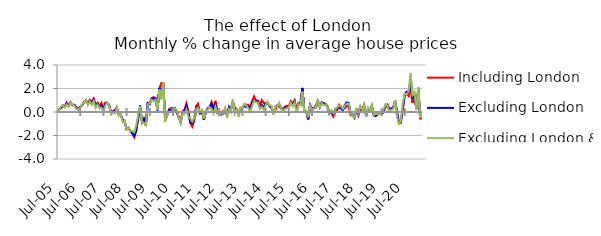
| Category | Including London | Excluding London | Excluding London & SE |
|---|---|---|---|
| 2005-07-01 | 0.014 | -0.006 | 0.09 |
| 2005-08-01 | 0.163 | 0.204 | 0.162 |
| 2005-09-01 | 0.324 | 0.325 | 0.462 |
| 2005-10-01 | 0.577 | 0.533 | 0.574 |
| 2005-11-01 | 0.466 | 0.417 | 0.391 |
| 2005-12-01 | 0.812 | 0.711 | 0.637 |
| 2006-01-01 | 0.5 | 0.49 | 0.413 |
| 2006-02-01 | 0.828 | 0.794 | 0.795 |
| 2006-03-01 | 0.563 | 0.637 | 0.633 |
| 2006-04-01 | 0.621 | 0.57 | 0.521 |
| 2006-05-01 | 0.386 | 0.352 | 0.256 |
| 2006-06-01 | 0.291 | 0.226 | 0.232 |
| 2006-07-01 | 0.438 | 0.412 | 0.342 |
| 2006-08-01 | 0.591 | 0.577 | 0.661 |
| 2006-09-01 | 0.848 | 0.81 | 0.786 |
| 2006-10-01 | 0.979 | 1.005 | 1.049 |
| 2006-11-01 | 0.775 | 0.651 | 0.593 |
| 2006-12-01 | 1.037 | 0.905 | 0.892 |
| 2007-01-01 | 0.858 | 0.697 | 0.609 |
| 2007-02-01 | 1.157 | 1.043 | 0.936 |
| 2007-03-01 | 0.591 | 0.493 | 0.34 |
| 2007-04-01 | 0.791 | 0.71 | 0.625 |
| 2007-05-01 | 0.495 | 0.385 | 0.394 |
| 2007-06-01 | 0.773 | 0.572 | 0.376 |
| 2007-07-01 | 0.314 | 0.122 | 0.088 |
| 2007-08-01 | 0.802 | 0.688 | 0.543 |
| 2007-09-01 | 0.779 | 0.781 | 0.791 |
| 2007-10-01 | 0.566 | 0.59 | 0.551 |
| 2007-11-01 | -0.121 | -0.088 | -0.213 |
| 2007-12-01 | 0.07 | 0.05 | -0.02 |
| 2008-01-01 | 0.193 | 0.09 | -0.129 |
| 2008-02-01 | 0.407 | 0.326 | 0.403 |
| 2008-03-01 | -0.27 | -0.262 | -0.309 |
| 2008-04-01 | -0.198 | -0.21 | -0.151 |
| 2008-05-01 | -0.666 | -0.685 | -0.88 |
| 2008-06-01 | -0.763 | -0.783 | -0.746 |
| 2008-07-01 | -1.456 | -1.471 | -1.501 |
| 2008-08-01 | -1.333 | -1.353 | -1.313 |
| 2008-09-01 | -1.666 | -1.602 | -1.648 |
| 2008-10-01 | -1.827 | -1.811 | -1.607 |
| 2008-11-01 | -2.152 | -2.056 | -1.731 |
| 2008-12-01 | -1.511 | -1.621 | -1.176 |
| 2009-01-01 | -0.593 | -0.517 | -0.245 |
| 2009-02-01 | 0.356 | 0.548 | 0.469 |
| 2009-03-01 | -0.862 | -0.838 | -0.892 |
| 2009-04-01 | -0.536 | -0.573 | -0.91 |
| 2009-05-01 | -0.786 | -1.169 | -1.113 |
| 2009-06-01 | 0.762 | 0.765 | 0.654 |
| 2009-07-01 | 0.77 | 0.668 | 0.757 |
| 2009-08-01 | 1.139 | 1.168 | 1.057 |
| 2009-09-01 | 1.284 | 1.066 | 0.915 |
| 2009-10-01 | 1.145 | 1.185 | 1.057 |
| 2009-11-01 | 0.204 | 0.132 | 0.175 |
| 2009-12-01 | 1.994 | 2.051 | 1.926 |
| 2010-01-01 | 2.456 | 1.338 | 1.065 |
| 2010-02-01 | 2.445 | 2.446 | 2.482 |
| 2010-03-01 | -0.631 | -0.699 | -0.798 |
| 2010-04-01 | -0.337 | -0.232 | -0.267 |
| 2010-05-01 | 0.08 | 0.209 | 0.025 |
| 2010-06-01 | 0.344 | 0.125 | 0.033 |
| 2010-07-01 | 0.307 | 0.142 | -0.011 |
| 2010-08-01 | 0.345 | 0.255 | 0.288 |
| 2010-09-01 | -0.055 | 0.062 | 0.191 |
| 2010-10-01 | -0.41 | -0.446 | -0.406 |
| 2010-11-01 | -0.762 | -0.901 | -0.892 |
| 2010-12-01 | 0.039 | -0.111 | -0.135 |
| 2011-01-01 | 0.213 | 0.123 | -0.163 |
| 2011-02-01 | 0.73 | 0.546 | 0.225 |
| 2011-03-01 | 0.086 | -0.077 | -0.432 |
| 2011-04-01 | -0.954 | -0.902 | -0.557 |
| 2011-05-01 | -1.249 | -0.981 | -0.818 |
| 2011-06-01 | -0.74 | -0.596 | -0.5 |
| 2011-07-01 | 0.505 | 0.275 | 0.127 |
| 2011-08-01 | 0.701 | 0.46 | 0.372 |
| 2011-09-01 | -0.047 | -0.129 | 0.006 |
| 2011-10-01 | 0.117 | 0.014 | 0.143 |
| 2011-11-01 | -0.617 | -0.667 | -0.587 |
| 2011-12-01 | 0.055 | -0.052 | 0.093 |
| 2012-01-01 | 0.295 | 0.294 | 0.186 |
| 2012-02-01 | 0.36 | 0.421 | 0.403 |
| 2012-03-01 | 0.843 | 0.717 | 0.273 |
| 2012-04-01 | 0.364 | 0.061 | -0.139 |
| 2012-05-01 | 0.952 | 0.595 | 0.425 |
| 2012-06-01 | -0.019 | -0.101 | -0.026 |
| 2012-07-01 | -0.072 | -0.142 | -0.294 |
| 2012-08-01 | -0.223 | -0.16 | -0.074 |
| 2012-09-01 | 0.09 | -0.186 | -0.136 |
| 2012-10-01 | 0.146 | 0.175 | 0.348 |
| 2012-11-01 | 0.01 | -0.282 | -0.45 |
| 2012-12-01 | 0.315 | 0.413 | 0.258 |
| 2013-01-01 | 0.332 | 0.067 | 0.042 |
| 2013-02-01 | 0.833 | 0.921 | 1.056 |
| 2013-03-01 | 0.377 | 0.077 | -0.149 |
| 2013-04-01 | 0.245 | 0.201 | 0.193 |
| 2013-05-01 | -0.058 | -0.181 | -0.399 |
| 2013-06-01 | 0.126 | 0.163 | 0.425 |
| 2013-07-01 | 0.41 | 0.376 | 0.327 |
| 2013-08-01 | 0.651 | 0.477 | 0.669 |
| 2013-09-01 | 0.62 | 0.419 | 0.535 |
| 2013-10-01 | 0.603 | 0.427 | 0.325 |
| 2013-11-01 | 0.38 | 0.14 | 0.019 |
| 2013-12-01 | 0.926 | 0.799 | 0.519 |
| 2014-01-01 | 1.335 | 0.991 | 0.948 |
| 2014-02-01 | 0.981 | 0.961 | 0.831 |
| 2014-03-01 | 0.985 | 0.866 | 0.783 |
| 2014-04-01 | 0.53 | 0.356 | 0.254 |
| 2014-05-01 | 1.019 | 0.588 | 0.447 |
| 2014-06-01 | 0.776 | 0.387 | 0.18 |
| 2014-07-01 | 0.717 | 0.724 | 0.564 |
| 2014-08-01 | 0.727 | 0.804 | 0.871 |
| 2014-09-01 | 0.572 | 0.476 | 0.556 |
| 2014-10-01 | 0.318 | 0.392 | 0.54 |
| 2014-11-01 | -0.016 | -0.05 | -0.201 |
| 2014-12-01 | 0.147 | 0.409 | 0.465 |
| 2015-01-01 | 0.541 | 0.556 | 0.472 |
| 2015-02-01 | 0.463 | 0.664 | 0.785 |
| 2015-03-01 | 0.276 | 0.404 | 0.313 |
| 2015-04-01 | 0.215 | 0.135 | 0.1 |
| 2015-05-01 | 0.462 | 0.387 | 0.265 |
| 2015-06-01 | 0.531 | 0.335 | 0.319 |
| 2015-07-01 | 0.504 | 0.475 | 0.439 |
| 2015-08-01 | 0.926 | 0.728 | 0.785 |
| 2015-09-01 | 0.744 | 0.63 | 0.47 |
| 2015-10-01 | 1.002 | 0.909 | 0.805 |
| 2015-11-01 | 0.18 | 0.057 | -0.084 |
| 2015-12-01 | 0.758 | 0.715 | 0.683 |
| 2016-01-01 | 0.731 | 0.64 | 0.563 |
| 2016-02-01 | 2.056 | 2.01 | 1.737 |
| 2016-03-01 | 0.095 | 0.048 | 0.044 |
| 2016-04-01 | 0.025 | 0.04 | 0.087 |
| 2016-05-01 | -0.678 | -0.567 | -0.446 |
| 2016-06-01 | 0.4 | 0.62 | 0.557 |
| 2016-07-01 | 0.156 | 0.297 | 0.17 |
| 2016-08-01 | 0.292 | 0.338 | 0.284 |
| 2016-09-01 | 0.57 | 0.376 | 0.394 |
| 2016-10-01 | 0.961 | 0.873 | 1.054 |
| 2016-11-01 | 0.568 | 0.405 | 0.425 |
| 2016-12-01 | 0.772 | 0.839 | 0.778 |
| 2017-01-01 | 0.752 | 0.746 | 0.58 |
| 2017-02-01 | 0.644 | 0.699 | 0.656 |
| 2017-03-01 | 0.524 | 0.42 | 0.472 |
| 2017-04-01 | -0.028 | -0.157 | -0.133 |
| 2017-05-01 | -0.034 | 0.05 | 0.137 |
| 2017-06-01 | -0.389 | -0.161 | -0.085 |
| 2017-07-01 | -0.047 | 0.204 | 0.271 |
| 2017-08-01 | 0.16 | 0.299 | 0.374 |
| 2017-09-01 | 0.615 | 0.383 | 0.545 |
| 2017-10-01 | 0.436 | 0.291 | 0.494 |
| 2017-11-01 | 0.329 | 0.132 | 0.255 |
| 2017-12-01 | 0.311 | 0.61 | 0.54 |
| 2018-01-01 | 0.543 | 0.82 | 0.699 |
| 2018-02-01 | 0.408 | 0.774 | 0.734 |
| 2018-03-01 | -0.275 | -0.1 | -0.134 |
| 2018-04-01 | -0.266 | -0.251 | -0.3 |
| 2018-05-01 | -0.302 | -0.503 | -0.45 |
| 2018-06-01 | 0.152 | 0.164 | 0.257 |
| 2018-07-01 | -0.316 | -0.198 | -0.056 |
| 2018-08-01 | 0.283 | 0.446 | 0.522 |
| 2018-09-01 | 0.257 | 0.111 | 0.166 |
| 2018-10-01 | 0.643 | 0.475 | 0.59 |
| 2018-11-01 | -0.297 | -0.358 | -0.315 |
| 2018-12-01 | 0.233 | 0.299 | 0.403 |
| 2019-01-01 | 0.149 | 0.237 | 0.126 |
| 2019-02-01 | 0.449 | 0.559 | 0.569 |
| 2019-03-01 | -0.311 | -0.241 | -0.234 |
| 2019-04-01 | -0.253 | -0.341 | -0.185 |
| 2019-05-01 | -0.005 | -0.213 | -0.168 |
| 2019-06-01 | -0.066 | -0.078 | -0.192 |
| 2019-07-01 | -0.17 | 0.04 | 0.075 |
| 2019-08-01 | -0.053 | 0.132 | 0.219 |
| 2019-09-01 | 0.55 | 0.453 | 0.664 |
| 2019-10-01 | 0.654 | 0.501 | 0.527 |
| 2019-11-01 | 0.326 | 0.135 | 0.017 |
| 2019-12-01 | 0.294 | 0.26 | 0.192 |
| 2020-01-01 | 0.432 | 0.341 | 0.239 |
| 2020-02-01 | 0.79 | 0.97 | 0.998 |
| 2020-03-01 | -0.024 | -0.06 | -0.425 |
| 2020-04-01 | -0.967 | -0.911 | -1.008 |
| 2020-05-01 | -0.842 | -0.911 | -0.768 |
| 2020-06-01 | 0.212 | 0.357 | 0.786 |
| 2020-07-01 | 1.369 | 1.524 | 1.543 |
| 2020-08-01 | 1.576 | 1.73 | 1.528 |
| 2020-09-01 | 1.362 | 1.675 | 1.737 |
| 2020-10-01 | 2.231 | 2.716 | 3.299 |
| 2020-11-01 | 0.772 | 1.17 | 1.423 |
| 2020-12-01 | 1.456 | 1.545 | 1.711 |
| 2021-01-01 | 0.309 | 0.244 | 0.207 |
| 2021-02-01 | 1.795 | 1.971 | 2.106 |
| 2021-03-01 | -0.615 | -0.411 | -0.485 |
| 2021-04-01 | -0.159 | -0.047 | -0.151 |
| 2021-05-01 | -0.677 | -0.705 | -0.684 |
| 2021-06-01 | 0.817 | 0.81 | 0.942 |